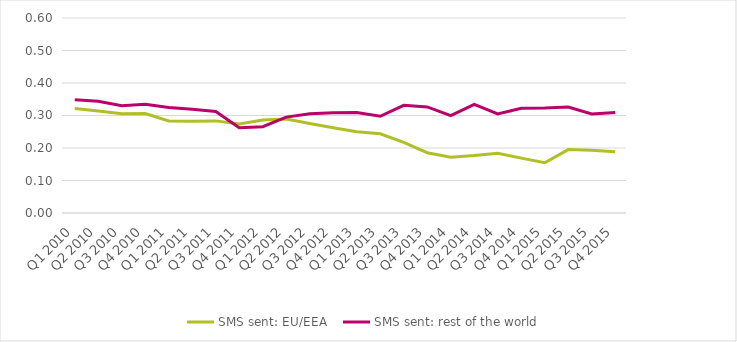
| Category | SMS sent: EU/EEA | SMS sent: rest of the world |
|---|---|---|
| Q1 2010 | 0.321 | 0.348 |
| Q2 2010 | 0.314 | 0.344 |
| Q3 2010 | 0.305 | 0.33 |
| Q4 2010 | 0.306 | 0.334 |
| Q1 2011 | 0.283 | 0.324 |
| Q2 2011 | 0.282 | 0.319 |
| Q3 2011 | 0.283 | 0.312 |
| Q4 2011 | 0.274 | 0.262 |
| Q1 2012 | 0.286 | 0.266 |
| Q2 2012 | 0.289 | 0.295 |
| Q3 2012 | 0.276 | 0.305 |
| Q4 2012 | 0.262 | 0.308 |
| Q1 2013 | 0.25 | 0.309 |
| Q2 2013 | 0.244 | 0.298 |
| Q3 2013 | 0.217 | 0.331 |
| Q4 2013 | 0.185 | 0.326 |
| Q1 2014 | 0.172 | 0.3 |
| Q2 2014 | 0.177 | 0.334 |
| Q3 2014 | 0.184 | 0.305 |
| Q4 2014 | 0.169 | 0.322 |
| Q1 2015 | 0.155 | 0.323 |
| Q2 2015 | 0.195 | 0.326 |
| Q3 2015 | 0.193 | 0.305 |
| Q4 2015 | 0.188 | 0.309 |